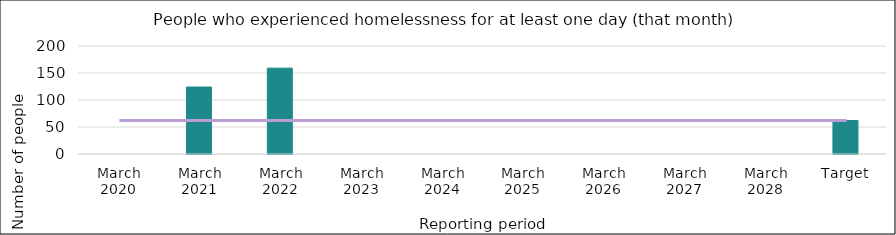
| Category | Series 0 |
|---|---|
| March 2020 | 0 |
| March 2021 | 124 |
| March 2022 | 159 |
| March 2023 | 0 |
| March 2024 | 0 |
| March 2025 | 0 |
| March 2026 | 0 |
| March 2027 | 0 |
| March 2028 | 0 |
| Target | 62 |